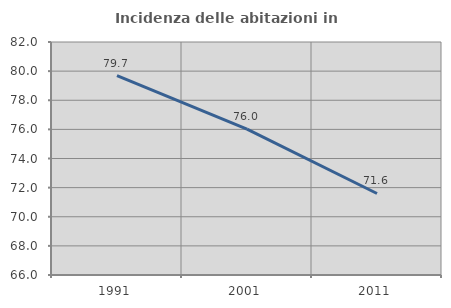
| Category | Incidenza delle abitazioni in proprietà  |
|---|---|
| 1991.0 | 79.684 |
| 2001.0 | 76.012 |
| 2011.0 | 71.598 |